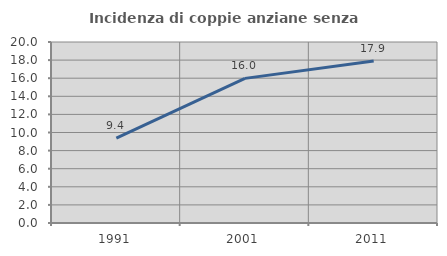
| Category | Incidenza di coppie anziane senza figli  |
|---|---|
| 1991.0 | 9.37 |
| 2001.0 | 15.981 |
| 2011.0 | 17.905 |